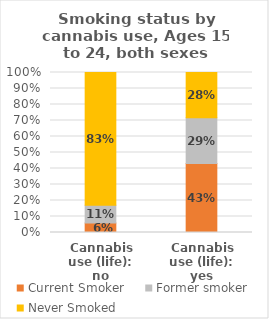
| Category | Current Smoker | Former smoker | Never Smoked |
|---|---|---|---|
| Cannabis use (life): no | 0.06 | 0.11 | 0.83 |
| Cannabis use (life): yes | 0.432 | 0.286 | 0.282 |